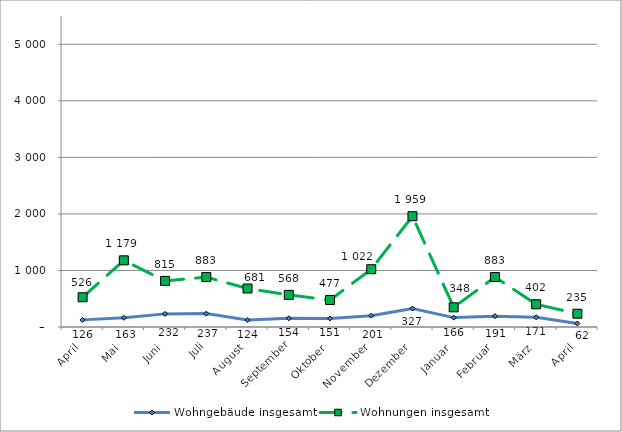
| Category | Wohngebäude insgesamt | Wohnungen insgesamt |
|---|---|---|
| April | 126 | 526 |
| Mai | 163 | 1179 |
| Juni | 232 | 815 |
| Juli | 237 | 883 |
| August | 124 | 681 |
| September | 154 | 568 |
| Oktober | 151 | 477 |
| November | 201 | 1022 |
| Dezember | 327 | 1959 |
| Januar | 166 | 348 |
| Februar | 191 | 883 |
| März | 171 | 402 |
| April | 62 | 235 |